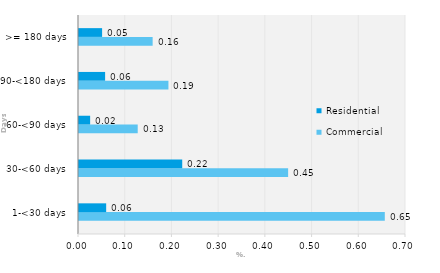
| Category | Commercial | Residential |
|---|---|---|
| 1-<30 days | 0.655 | 0.058 |
| 30-<60 days | 0.448 | 0.221 |
| 60-<90 days | 0.126 | 0.024 |
| 90-<180 days | 0.191 | 0.056 |
| >= 180 days | 0.158 | 0.049 |